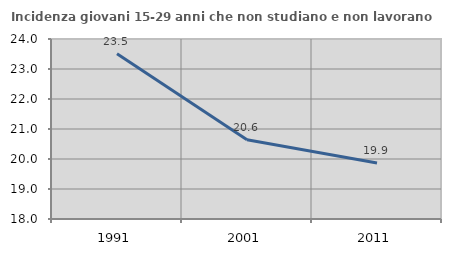
| Category | Incidenza giovani 15-29 anni che non studiano e non lavorano  |
|---|---|
| 1991.0 | 23.51 |
| 2001.0 | 20.643 |
| 2011.0 | 19.869 |